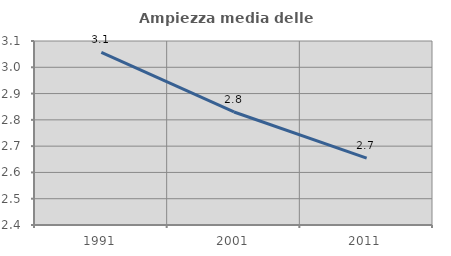
| Category | Ampiezza media delle famiglie |
|---|---|
| 1991.0 | 3.057 |
| 2001.0 | 2.83 |
| 2011.0 | 2.655 |